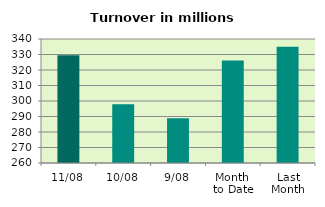
| Category | Series 0 |
|---|---|
| 11/08 | 329.537 |
| 10/08 | 297.833 |
| 9/08 | 288.906 |
| Month 
to Date | 326.069 |
| Last
Month | 334.97 |